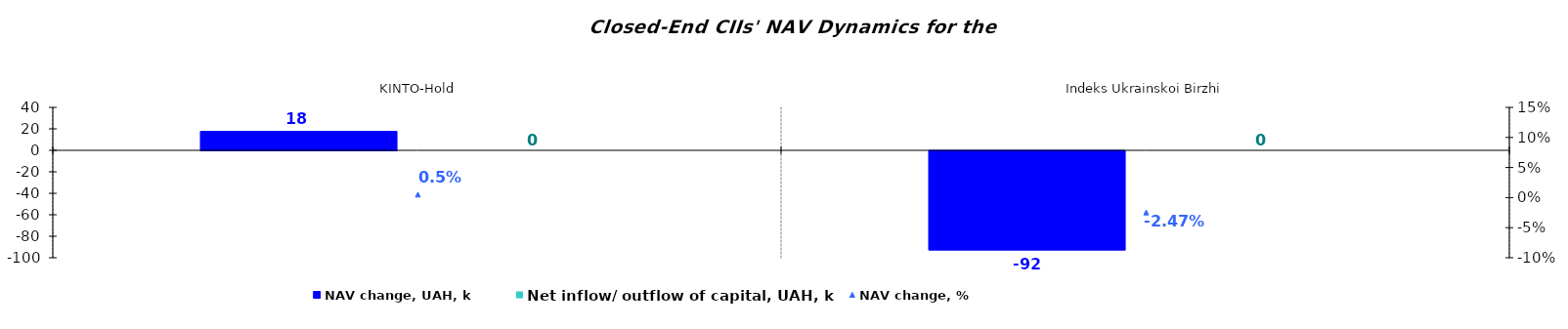
| Category | NAV change, UAH, k | Net inflow/ outflow of capital, UAH, k |
|---|---|---|
|  KINTO-Hold | 17.68 | 0 |
| Іndeks Ukrainskoi Birzhi | -92.269 | 0 |